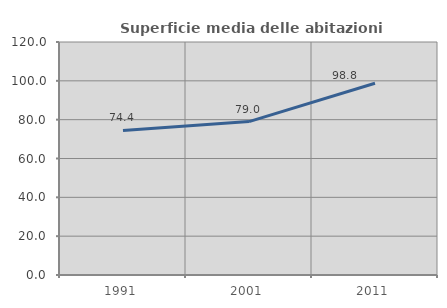
| Category | Superficie media delle abitazioni occupate |
|---|---|
| 1991.0 | 74.449 |
| 2001.0 | 79.017 |
| 2011.0 | 98.752 |